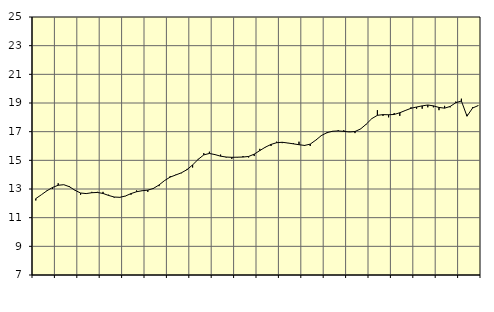
| Category | Piggar | Finansiell verksamhet, företagstjänster, SNI 64-82 |
|---|---|---|
| nan | 12.2 | 12.33 |
| 1.0 | 12.6 | 12.6 |
| 1.0 | 12.9 | 12.88 |
| 1.0 | 13 | 13.11 |
| nan | 13.4 | 13.26 |
| 2.0 | 13.3 | 13.3 |
| 2.0 | 13.2 | 13.16 |
| 2.0 | 12.9 | 12.91 |
| nan | 12.6 | 12.72 |
| 3.0 | 12.7 | 12.68 |
| 3.0 | 12.8 | 12.74 |
| 3.0 | 12.8 | 12.76 |
| nan | 12.8 | 12.69 |
| 4.0 | 12.6 | 12.55 |
| 4.0 | 12.4 | 12.44 |
| 4.0 | 12.4 | 12.42 |
| nan | 12.5 | 12.51 |
| 5.0 | 12.6 | 12.68 |
| 5.0 | 12.9 | 12.81 |
| 5.0 | 12.9 | 12.88 |
| nan | 12.8 | 12.92 |
| 6.0 | 13 | 13.04 |
| 6.0 | 13.2 | 13.28 |
| 6.0 | 13.6 | 13.59 |
| nan | 13.9 | 13.83 |
| 7.0 | 14 | 13.98 |
| 7.0 | 14.1 | 14.13 |
| 7.0 | 14.4 | 14.35 |
| nan | 14.5 | 14.68 |
| 8.0 | 15.1 | 15.07 |
| 8.0 | 15.5 | 15.38 |
| 8.0 | 15.6 | 15.48 |
| nan | 15.4 | 15.4 |
| 9.0 | 15.4 | 15.29 |
| 9.0 | 15.2 | 15.23 |
| 9.0 | 15.1 | 15.21 |
| nan | 15.2 | 15.22 |
| 10.0 | 15.3 | 15.23 |
| 10.0 | 15.2 | 15.27 |
| 10.0 | 15.3 | 15.43 |
| nan | 15.8 | 15.68 |
| 11.0 | 15.9 | 15.92 |
| 11.0 | 16 | 16.11 |
| 11.0 | 16.3 | 16.23 |
| nan | 16.2 | 16.26 |
| 12.0 | 16.2 | 16.21 |
| 12.0 | 16.2 | 16.15 |
| 12.0 | 16.3 | 16.09 |
| nan | 16 | 16.04 |
| 13.0 | 16 | 16.13 |
| 13.0 | 16.4 | 16.41 |
| 13.0 | 16.7 | 16.73 |
| nan | 16.9 | 16.93 |
| 14.0 | 17 | 17.03 |
| 14.0 | 17.1 | 17.05 |
| 14.0 | 17.1 | 17.02 |
| nan | 17 | 16.98 |
| 15.0 | 16.9 | 17.01 |
| 15.0 | 17.2 | 17.19 |
| 15.0 | 17.5 | 17.52 |
| nan | 17.9 | 17.91 |
| 16.0 | 18.5 | 18.14 |
| 16.0 | 18.1 | 18.19 |
| 16.0 | 18 | 18.18 |
| nan | 18.3 | 18.2 |
| 17.0 | 18.1 | 18.32 |
| 17.0 | 18.5 | 18.48 |
| 17.0 | 18.7 | 18.63 |
| nan | 18.6 | 18.72 |
| 18.0 | 18.6 | 18.8 |
| 18.0 | 18.7 | 18.86 |
| 18.0 | 18.7 | 18.8 |
| nan | 18.5 | 18.69 |
| 19.0 | 18.8 | 18.64 |
| 19.0 | 18.7 | 18.76 |
| 19.0 | 19.1 | 19.02 |
| nan | 19.3 | 19.14 |
| 20.0 | 18.2 | 18.08 |
| 20.0 | 18.7 | 18.65 |
| 20.0 | 18.8 | 18.82 |